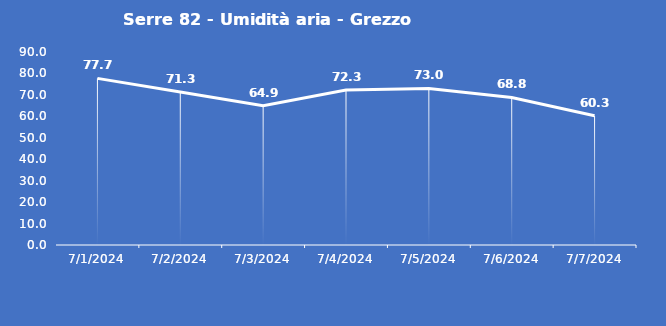
| Category | Serre 82 - Umidità aria - Grezzo (%) |
|---|---|
| 7/1/24 | 77.7 |
| 7/2/24 | 71.3 |
| 7/3/24 | 64.9 |
| 7/4/24 | 72.3 |
| 7/5/24 | 73 |
| 7/6/24 | 68.8 |
| 7/7/24 | 60.3 |